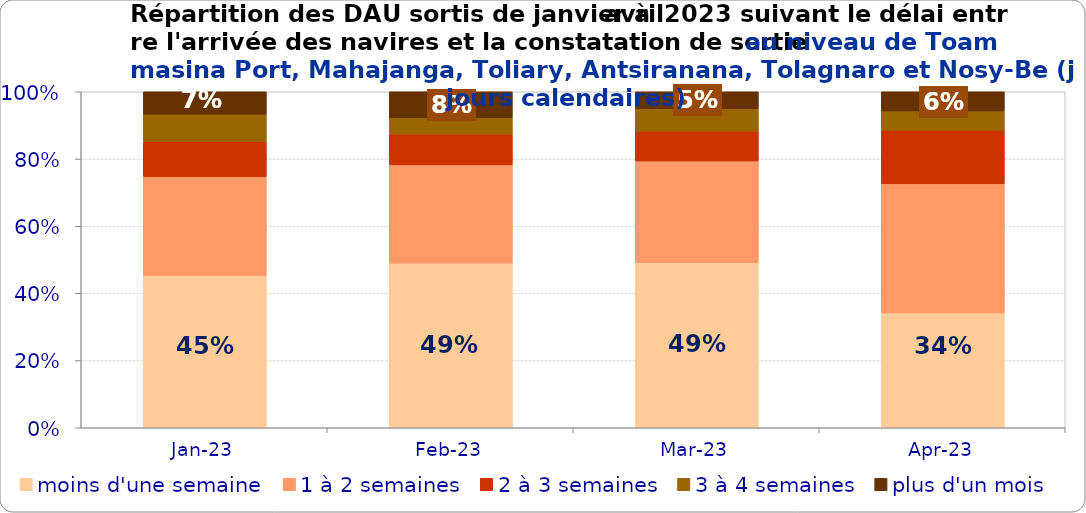
| Category | moins d'une semaine | 1 à 2 semaines | 2 à 3 semaines | 3 à 4 semaines | plus d'un mois |
|---|---|---|---|---|---|
| 2023-01-01 | 0.454 | 0.294 | 0.104 | 0.081 | 0.067 |
| 2023-02-01 | 0.49 | 0.292 | 0.092 | 0.048 | 0.078 |
| 2023-03-01 | 0.492 | 0.303 | 0.089 | 0.066 | 0.051 |
| 2023-04-01 | 0.342 | 0.384 | 0.16 | 0.057 | 0.057 |